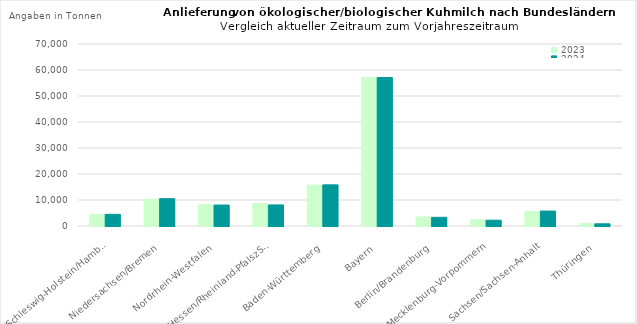
| Category | 2023 | 2024 |
|---|---|---|
| Schleswig-Holstein/Hamburg | 4410.482 | 4485.147 |
| Niedersachsen/Bremen | 10239.963 | 10510.113 |
| Nordrhein-Westfalen | 8247.338 | 8058.084 |
| Hessen/Rheinland-PfalszSaarland | 8612.531 | 8105.014 |
| Baden-Württemberg | 15719.087 | 15823.478 |
| Bayern | 57197.043 | 57099.51 |
| Berlin/Brandenburg | 3513.957 | 3339.608 |
| Mecklenburg-Vorpommern | 2408.413 | 2226.15 |
| Sachsen/Sachsen-Anhalt | 5531.22 | 5743.814 |
| Thüringen | 899.296 | 836.955 |